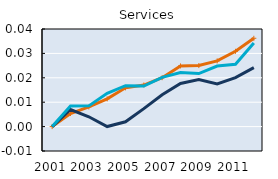
| Category | Gross output (p90) | Employment (p90) | Value added (p90) |
|---|---|---|---|
| 2001.0 | 0 | 0 | 0 |
| 2002.0 | 0.005 | 0.007 | 0.008 |
| 2003.0 | 0.008 | 0.004 | 0.008 |
| 2004.0 | 0.011 | 0 | 0.014 |
| 2005.0 | 0.016 | 0.002 | 0.017 |
| 2006.0 | 0.017 | 0.007 | 0.017 |
| 2007.0 | 0.02 | 0.013 | 0.02 |
| 2008.0 | 0.025 | 0.018 | 0.022 |
| 2009.0 | 0.025 | 0.019 | 0.022 |
| 2010.0 | 0.027 | 0.018 | 0.025 |
| 2011.0 | 0.031 | 0.02 | 0.026 |
| 2012.0 | 0.036 | 0.024 | 0.034 |